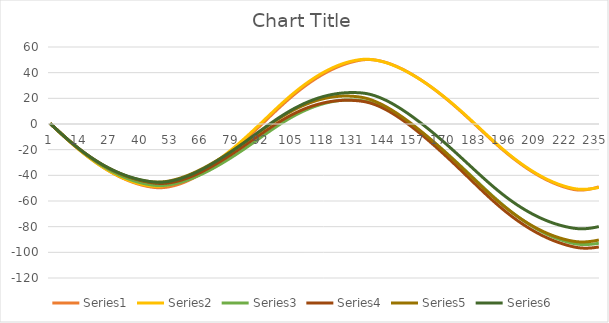
| Category | Series 0 | Series 1 | Series 2 | Series 3 | Series 4 | Series 5 |
|---|---|---|---|---|---|---|
| 0 | 0.4 | 0.4 | 0.4 | 0.4 | 0.4 | 0.4 |
| 1 | -1.3 | -1.302 | -1.299 | -1.296 | -1.297 | -1.296 |
| 2 | -2.99 | -3.008 | -2.993 | -2.984 | -2.985 | -2.984 |
| 3 | -4.69 | -4.713 | -4.68 | -4.659 | -4.663 | -4.659 |
| 4 | -6.38 | -6.414 | -6.357 | -6.32 | -6.327 | -6.32 |
| 5 | -8.07 | -8.107 | -8.022 | -7.964 | -7.975 | -7.964 |
| 6 | -9.74 | -9.789 | -9.67 | -9.588 | -9.604 | -9.587 |
| 7 | -11.4 | -11.456 | -11.301 | -11.189 | -11.21 | -11.187 |
| 8 | -13.03 | -13.103 | -12.909 | -12.763 | -12.792 | -12.761 |
| 9 | -14.65 | -14.726 | -14.494 | -14.31 | -14.346 | -14.306 |
| 10 | -16.24 | -16.324 | -16.052 | -15.827 | -15.869 | -15.821 |
| 11 | -17.81 | -17.894 | -17.581 | -17.311 | -17.361 | -17.302 |
| 12 | -19.35 | -19.434 | -19.08 | -18.761 | -18.819 | -18.749 |
| 13 | -20.85 | -20.943 | -20.549 | -20.178 | -20.244 | -20.162 |
| 14 | -22.33 | -22.42 | -21.984 | -21.559 | -21.633 | -21.538 |
| 15 | -23.78 | -23.862 | -23.387 | -22.904 | -22.985 | -22.878 |
| 16 | -25.2 | -25.269 | -24.755 | -24.212 | -24.301 | -24.18 |
| 17 | -26.58 | -26.642 | -26.088 | -25.485 | -25.579 | -25.446 |
| 18 | -27.93 | -27.98 | -27.387 | -26.72 | -26.82 | -26.673 |
| 19 | -29.25 | -29.284 | -28.651 | -27.92 | -28.024 | -27.864 |
| 20 | -30.53 | -30.554 | -29.882 | -29.084 | -29.192 | -29.019 |
| 21 | -31.78 | -31.788 | -31.076 | -30.213 | -30.323 | -30.137 |
| 22 | -32.98 | -32.985 | -32.235 | -31.304 | -31.415 | -31.217 |
| 23 | -34.16 | -34.144 | -33.356 | -32.358 | -32.467 | -32.258 |
| 24 | -35.29 | -35.262 | -34.439 | -33.375 | -33.48 | -33.26 |
| 25 | -36.39 | -36.34 | -35.484 | -34.354 | -34.453 | -34.224 |
| 26 | -37.45 | -37.379 | -36.491 | -35.296 | -35.387 | -35.15 |
| 27 | -38.48 | -38.377 | -37.461 | -36.201 | -36.282 | -36.037 |
| 28 | -39.46 | -39.333 | -38.39 | -37.068 | -37.135 | -36.884 |
| 29 | -40.4 | -40.245 | -39.278 | -37.896 | -37.946 | -37.691 |
| 30 | -41.3 | -41.114 | -40.126 | -38.687 | -38.717 | -38.459 |
| 31 | -42.16 | -41.939 | -40.934 | -39.439 | -39.446 | -39.188 |
| 32 | -42.98 | -42.718 | -41.701 | -40.154 | -40.134 | -39.877 |
| 33 | -43.75 | -43.451 | -42.426 | -40.832 | -40.78 | -40.526 |
| 34 | -44.48 | -44.139 | -43.109 | -41.47 | -41.383 | -41.136 |
| 35 | -45.17 | -44.782 | -43.751 | -42.071 | -41.945 | -41.706 |
| 36 | -45.81 | -45.38 | -44.351 | -42.637 | -42.465 | -42.238 |
| 37 | -46.41 | -45.933 | -44.91 | -43.166 | -42.945 | -42.732 |
| 38 | -46.97 | -46.437 | -45.427 | -43.658 | -43.382 | -43.187 |
| 39 | -47.47 | -46.892 | -45.902 | -44.114 | -43.778 | -43.604 |
| 40 | -47.94 | -47.294 | -46.333 | -44.533 | -44.132 | -43.982 |
| 41 | -48.35 | -47.646 | -46.723 | -44.917 | -44.444 | -44.322 |
| 42 | -48.72 | -47.945 | -47.069 | -45.266 | -44.715 | -44.624 |
| 43 | -49.04 | -48.188 | -47.373 | -45.579 | -44.943 | -44.889 |
| 44 | -49.32 | -48.373 | -47.63 | -45.854 | -45.127 | -45.113 |
| 45 | -49.53 | -48.488 | -47.828 | -46.078 | -45.253 | -45.283 |
| 46 | -49.65 | -48.514 | -47.948 | -46.234 | -45.303 | -45.383 |
| 47 | -49.67 | -48.442 | -47.983 | -46.315 | -45.27 | -45.405 |
| 48 | -49.6 | -48.28 | -47.936 | -46.316 | -45.156 | -45.346 |
| 49 | -49.44 | -48.044 | -47.816 | -46.237 | -44.967 | -45.209 |
| 50 | -49.21 | -47.737 | -47.629 | -46.079 | -44.708 | -44.996 |
| 51 | -48.9 | -47.36 | -47.376 | -45.848 | -44.383 | -44.712 |
| 52 | -48.52 | -46.924 | -47.069 | -45.553 | -44.001 | -44.367 |
| 53 | -48.08 | -46.433 | -46.712 | -45.202 | -43.569 | -43.968 |
| 54 | -47.59 | -45.885 | -46.307 | -44.795 | -43.088 | -43.513 |
| 55 | -47.03 | -45.284 | -45.854 | -44.334 | -42.557 | -43.006 |
| 56 | -46.41 | -44.627 | -45.353 | -43.819 | -41.978 | -42.447 |
| 57 | -45.73 | -43.916 | -44.805 | -43.251 | -41.352 | -41.836 |
| 58 | -44.99 | -43.153 | -44.213 | -42.635 | -40.682 | -41.178 |
| 59 | -44.19 | -42.341 | -43.58 | -41.973 | -39.971 | -40.474 |
| 60 | -43.34 | -41.482 | -42.907 | -41.267 | -39.22 | -39.728 |
| 61 | -42.45 | -40.578 | -42.197 | -40.522 | -38.434 | -38.943 |
| 62 | -41.51 | -39.632 | -41.454 | -39.74 | -37.613 | -38.12 |
| 63 | -40.52 | -38.645 | -40.677 | -38.922 | -36.761 | -37.263 |
| 64 | -39.49 | -37.616 | -39.866 | -38.068 | -35.875 | -36.37 |
| 65 | -38.42 | -36.544 | -39.021 | -37.179 | -34.957 | -35.441 |
| 66 | -37.3 | -35.432 | -38.143 | -36.255 | -34.008 | -34.478 |
| 67 | -36.14 | -34.281 | -37.235 | -35.301 | -33.029 | -33.483 |
| 68 | -34.94 | -33.094 | -36.299 | -34.319 | -32.025 | -32.461 |
| 69 | -33.7 | -31.874 | -35.338 | -33.311 | -30.997 | -31.412 |
| 70 | -32.42 | -30.619 | -34.351 | -32.277 | -29.946 | -30.338 |
| 71 | -31.12 | -29.331 | -33.34 | -31.22 | -28.871 | -29.239 |
| 72 | -29.78 | -28.011 | -32.305 | -30.141 | -27.776 | -28.117 |
| 73 | -28.41 | -26.661 | -31.248 | -29.041 | -26.662 | -26.974 |
| 74 | -27.01 | -25.281 | -30.171 | -27.921 | -25.528 | -25.81 |
| 75 | -25.58 | -23.873 | -29.073 | -26.783 | -24.378 | -24.628 |
| 76 | -24.12 | -22.437 | -27.957 | -25.629 | -23.211 | -23.428 |
| 77 | -22.64 | -20.975 | -26.822 | -24.459 | -22.03 | -22.212 |
| 78 | -21.13 | -19.486 | -25.67 | -23.274 | -20.832 | -20.98 |
| 79 | -19.59 | -17.97 | -24.499 | -22.073 | -19.62 | -19.731 |
| 80 | -18.03 | -16.428 | -23.312 | -20.859 | -18.395 | -18.468 |
| 81 | -16.44 | -14.861 | -22.108 | -19.631 | -17.155 | -17.19 |
| 82 | -14.83 | -13.268 | -20.886 | -18.39 | -15.902 | -15.897 |
| 83 | -13.19 | -11.651 | -19.649 | -17.137 | -14.636 | -14.591 |
| 84 | -11.54 | -10.012 | -18.399 | -15.874 | -13.36 | -13.276 |
| 85 | -9.86 | -8.352 | -17.137 | -14.605 | -12.077 | -11.951 |
| 86 | -8.17 | -6.675 | -15.866 | -13.33 | -10.788 | -10.621 |
| 87 | -6.46 | -4.982 | -14.588 | -12.054 | -9.496 | -9.288 |
| 88 | -4.75 | -3.276 | -13.306 | -10.777 | -8.204 | -7.953 |
| 89 | -3.02 | -1.559 | -12.022 | -9.504 | -6.913 | -6.62 |
| 90 | -1.29 | 0.165 | -10.739 | -8.236 | -5.627 | -5.291 |
| 91 | 0.45 | 1.896 | -9.458 | -6.975 | -4.346 | -3.969 |
| 92 | 2.19 | 3.631 | -8.181 | -5.723 | -3.074 | -2.653 |
| 93 | 3.93 | 5.366 | -6.911 | -4.484 | -1.813 | -1.349 |
| 94 | 5.67 | 7.1 | -5.651 | -3.259 | -0.565 | -0.058 |
| 95 | 7.4 | 8.83 | -4.402 | -2.05 | 0.668 | 1.218 |
| 96 | 9.12 | 10.552 | -3.168 | -0.861 | 1.882 | 2.475 |
| 97 | 10.83 | 12.262 | -1.951 | 0.305 | 3.075 | 3.712 |
| 98 | 12.52 | 13.955 | -0.755 | 1.447 | 4.244 | 4.924 |
| 99 | 14.2 | 15.628 | 0.418 | 2.561 | 5.385 | 6.11 |
| 100 | 15.85 | 17.279 | 1.567 | 3.645 | 6.499 | 7.269 |
| 101 | 17.48 | 18.903 | 2.687 | 4.698 | 7.581 | 8.396 |
| 102 | 19.08 | 20.497 | 3.777 | 5.716 | 8.629 | 9.49 |
| 103 | 20.65 | 22.059 | 4.834 | 6.697 | 9.641 | 10.548 |
| 104 | 22.19 | 23.589 | 5.858 | 7.642 | 10.617 | 11.571 |
| 105 | 23.69 | 25.085 | 6.847 | 8.55 | 11.554 | 12.557 |
| 106 | 25.17 | 26.546 | 7.801 | 9.419 | 12.454 | 13.506 |
| 107 | 26.61 | 27.971 | 8.72 | 10.25 | 13.315 | 14.418 |
| 108 | 28.01 | 29.361 | 9.602 | 11.042 | 14.137 | 15.292 |
| 109 | 29.37 | 30.714 | 10.447 | 11.796 | 14.92 | 16.128 |
| 110 | 30.7 | 32.03 | 11.254 | 12.51 | 15.661 | 16.924 |
| 111 | 31.99 | 33.307 | 12.021 | 13.182 | 16.361 | 17.681 |
| 112 | 33.25 | 34.546 | 12.75 | 13.817 | 17.021 | 18.399 |
| 113 | 34.46 | 35.747 | 13.441 | 14.411 | 17.639 | 19.079 |
| 114 | 35.64 | 36.908 | 14.091 | 14.966 | 18.217 | 19.72 |
| 115 | 36.77 | 38.029 | 14.703 | 15.482 | 18.753 | 20.321 |
| 116 | 37.87 | 39.109 | 15.272 | 15.957 | 19.245 | 20.882 |
| 117 | 38.92 | 40.146 | 15.8 | 16.391 | 19.695 | 21.403 |
| 118 | 39.94 | 41.139 | 16.287 | 16.785 | 20.102 | 21.884 |
| 119 | 40.91 | 42.086 | 16.731 | 17.138 | 20.465 | 22.324 |
| 120 | 41.84 | 42.988 | 17.132 | 17.451 | 20.784 | 22.724 |
| 121 | 42.72 | 43.843 | 17.491 | 17.723 | 21.06 | 23.083 |
| 122 | 43.57 | 44.65 | 17.806 | 17.955 | 21.292 | 23.402 |
| 123 | 44.36 | 45.409 | 18.077 | 18.146 | 21.479 | 23.68 |
| 124 | 45.12 | 46.118 | 18.303 | 18.296 | 21.621 | 23.918 |
| 125 | 45.82 | 46.778 | 18.485 | 18.405 | 21.718 | 24.114 |
| 126 | 46.48 | 47.387 | 18.622 | 18.475 | 21.77 | 24.27 |
| 127 | 47.09 | 47.946 | 18.714 | 18.505 | 21.779 | 24.387 |
| 128 | 47.66 | 48.455 | 18.763 | 18.496 | 21.743 | 24.464 |
| 129 | 48.18 | 48.913 | 18.767 | 18.449 | 21.664 | 24.503 |
| 130 | 48.65 | 49.319 | 18.727 | 18.364 | 21.541 | 24.503 |
| 131 | 49.08 | 49.673 | 18.642 | 18.241 | 21.373 | 24.463 |
| 132 | 49.46 | 49.973 | 18.51 | 18.077 | 21.16 | 24.384 |
| 133 | 49.78 | 50.214 | 18.326 | 17.871 | 20.897 | 24.26 |
| 134 | 50.03 | 50.384 | 18.08 | 17.609 | 20.573 | 24.081 |
| 135 | 50.19 | 50.468 | 17.757 | 17.28 | 20.173 | 23.832 |
| 136 | 50.25 | 50.456 | 17.348 | 16.873 | 19.689 | 23.506 |
| 137 | 50.21 | 50.344 | 16.848 | 16.387 | 19.116 | 23.098 |
| 138 | 50.08 | 50.158 | 16.275 | 15.819 | 18.469 | 22.61 |
| 139 | 49.87 | 49.9 | 15.635 | 15.173 | 17.752 | 22.045 |
| 140 | 49.59 | 49.577 | 14.933 | 14.456 | 16.971 | 21.41 |
| 141 | 49.24 | 49.194 | 14.177 | 13.676 | 16.135 | 20.713 |
| 142 | 48.84 | 48.754 | 13.37 | 12.839 | 15.247 | 19.96 |
| 143 | 48.37 | 48.259 | 12.515 | 11.945 | 14.31 | 19.151 |
| 144 | 47.85 | 47.71 | 11.613 | 10.997 | 13.324 | 18.288 |
| 145 | 47.26 | 47.105 | 10.662 | 9.995 | 12.29 | 17.372 |
| 146 | 46.61 | 46.445 | 9.664 | 8.939 | 11.207 | 16.402 |
| 147 | 45.9 | 45.732 | 8.62 | 7.833 | 10.079 | 15.383 |
| 148 | 45.14 | 44.97 | 7.535 | 6.681 | 8.909 | 14.318 |
| 149 | 44.34 | 44.165 | 6.415 | 5.489 | 7.705 | 13.215 |
| 150 | 43.49 | 43.322 | 5.265 | 4.264 | 6.471 | 12.077 |
| 151 | 42.6 | 42.438 | 4.083 | 3.004 | 5.205 | 10.905 |
| 152 | 41.68 | 41.515 | 2.869 | 1.709 | 3.909 | 9.699 |
| 153 | 40.71 | 40.553 | 1.624 | 0.381 | 2.582 | 8.458 |
| 154 | 39.7 | 39.552 | 0.349 | -0.98 | 1.226 | 7.186 |
| 155 | 38.65 | 38.514 | -0.954 | -2.371 | -0.157 | 5.884 |
| 156 | 37.56 | 37.443 | -2.283 | -3.788 | -1.564 | 4.555 |
| 157 | 36.44 | 36.342 | -3.634 | -5.228 | -2.992 | 3.203 |
| 158 | 35.29 | 35.211 | -5.005 | -6.69 | -4.438 | 1.829 |
| 159 | 34.11 | 34.051 | -6.397 | -8.174 | -5.904 | 0.434 |
| 160 | 32.89 | 32.86 | -7.81 | -9.678 | -7.39 | -0.983 |
| 161 | 31.65 | 31.639 | -9.246 | -11.205 | -8.896 | -2.422 |
| 162 | 30.37 | 30.387 | -10.705 | -12.754 | -10.422 | -3.883 |
| 163 | 29.06 | 29.104 | -12.186 | -14.325 | -11.969 | -5.367 |
| 164 | 27.72 | 27.791 | -13.688 | -15.916 | -13.535 | -6.871 |
| 165 | 26.35 | 26.45 | -15.209 | -17.525 | -15.118 | -8.393 |
| 166 | 24.95 | 25.081 | -16.75 | -19.152 | -16.717 | -9.934 |
| 167 | 23.53 | 23.685 | -18.31 | -20.796 | -18.333 | -11.492 |
| 168 | 22.09 | 22.264 | -19.885 | -22.454 | -19.962 | -13.064 |
| 169 | 20.61 | 20.819 | -21.476 | -24.125 | -21.604 | -14.649 |
| 170 | 19.12 | 19.347 | -23.084 | -25.81 | -23.26 | -16.25 |
| 171 | 17.59 | 17.851 | -24.709 | -27.51 | -24.93 | -17.865 |
| 172 | 16.05 | 16.33 | -26.35 | -29.222 | -26.612 | -19.493 |
| 173 | 14.48 | 14.786 | -28.004 | -30.945 | -28.306 | -21.132 |
| 174 | 12.89 | 13.221 | -29.672 | -32.678 | -30.009 | -22.781 |
| 175 | 11.28 | 11.635 | -31.351 | -34.418 | -31.72 | -24.439 |
| 176 | 9.66 | 10.03 | -33.041 | -36.166 | -33.44 | -26.104 |
| 177 | 8.01 | 8.406 | -34.741 | -37.92 | -35.165 | -27.776 |
| 178 | 6.35 | 6.767 | -36.448 | -39.677 | -36.894 | -29.451 |
| 179 | 4.68 | 5.111 | -38.163 | -41.437 | -38.627 | -31.129 |
| 180 | 2.99 | 3.441 | -39.884 | -43.199 | -40.363 | -32.81 |
| 181 | 1.3 | 1.758 | -41.61 | -44.961 | -42.1 | -34.491 |
| 182 | -0.4 | 0.066 | -43.337 | -46.72 | -43.835 | -36.169 |
| 183 | -2.11 | -1.633 | -45.062 | -48.472 | -45.564 | -37.841 |
| 184 | -3.82 | -3.336 | -46.784 | -50.217 | -47.286 | -39.505 |
| 185 | -5.53 | -5.039 | -48.499 | -51.95 | -48.997 | -41.158 |
| 186 | -7.23 | -6.74 | -50.205 | -53.669 | -50.696 | -42.796 |
| 187 | -8.93 | -8.435 | -51.9 | -55.372 | -52.38 | -44.419 |
| 188 | -10.62 | -10.119 | -53.58 | -57.056 | -54.045 | -46.022 |
| 189 | -12.29 | -11.79 | -55.242 | -58.718 | -55.689 | -47.603 |
| 190 | -13.94 | -13.445 | -56.885 | -60.356 | -57.31 | -49.159 |
| 191 | -15.57 | -15.08 | -58.506 | -61.968 | -58.905 | -50.689 |
| 192 | -17.18 | -16.691 | -60.102 | -63.551 | -60.472 | -52.19 |
| 193 | -18.77 | -18.276 | -61.671 | -65.103 | -62.009 | -53.659 |
| 194 | -20.32 | -19.834 | -63.211 | -66.622 | -63.513 | -55.095 |
| 195 | -21.86 | -21.364 | -64.722 | -68.109 | -64.985 | -56.498 |
| 196 | -23.36 | -22.866 | -66.204 | -69.564 | -66.425 | -57.868 |
| 197 | -24.83 | -24.337 | -67.654 | -70.985 | -67.83 | -59.204 |
| 198 | -26.28 | -25.776 | -69.072 | -72.371 | -69.2 | -60.504 |
| 199 | -27.69 | -27.184 | -70.457 | -73.721 | -70.535 | -61.768 |
| 200 | -29.07 | -28.559 | -71.808 | -75.036 | -71.833 | -62.995 |
| 201 | -30.42 | -29.901 | -73.125 | -76.314 | -73.094 | -64.185 |
| 202 | -31.73 | -31.209 | -74.406 | -77.556 | -74.316 | -65.337 |
| 203 | -33.02 | -32.484 | -75.652 | -78.761 | -75.502 | -66.453 |
| 204 | -34.26 | -33.726 | -76.864 | -79.932 | -76.652 | -67.533 |
| 205 | -35.48 | -34.934 | -78.041 | -81.067 | -77.764 | -68.576 |
| 206 | -36.65 | -36.108 | -79.183 | -82.167 | -78.84 | -69.583 |
| 207 | -37.8 | -37.245 | -80.288 | -83.231 | -79.876 | -70.552 |
| 208 | -38.9 | -38.343 | -81.355 | -84.257 | -80.874 | -71.483 |
| 209 | -39.97 | -39.404 | -82.386 | -85.247 | -81.833 | -72.377 |
| 210 | -40.99 | -40.425 | -83.378 | -86.2 | -82.753 | -73.232 |
| 211 | -41.98 | -41.405 | -84.331 | -87.116 | -83.632 | -74.048 |
| 212 | -42.93 | -42.345 | -85.246 | -87.996 | -84.472 | -74.827 |
| 213 | -43.84 | -43.242 | -86.12 | -88.837 | -85.27 | -75.566 |
| 214 | -44.7 | -44.097 | -86.954 | -89.64 | -86.028 | -76.265 |
| 215 | -45.53 | -44.908 | -87.747 | -90.406 | -86.743 | -76.925 |
| 216 | -46.31 | -45.678 | -88.5 | -91.136 | -87.419 | -77.547 |
| 217 | -47.05 | -46.403 | -89.213 | -91.829 | -88.054 | -78.131 |
| 218 | -47.74 | -47.083 | -89.885 | -92.485 | -88.647 | -78.676 |
| 219 | -48.39 | -47.718 | -90.516 | -93.105 | -89.2 | -79.183 |
| 220 | -49 | -48.308 | -91.105 | -93.688 | -89.711 | -79.652 |
| 221 | -49.56 | -48.852 | -91.652 | -94.235 | -90.181 | -80.082 |
| 222 | -50.07 | -49.348 | -92.157 | -94.745 | -90.609 | -80.474 |
| 223 | -50.54 | -49.793 | -92.618 | -95.218 | -90.993 | -80.825 |
| 224 | -50.93 | -50.183 | -93.028 | -95.646 | -91.327 | -81.13 |
| 225 | -51.24 | -50.502 | -93.375 | -96.02 | -91.6 | -81.378 |
| 226 | -51.44 | -50.737 | -93.644 | -96.324 | -91.796 | -81.554 |
| 227 | -51.51 | -50.879 | -93.828 | -96.551 | -91.909 | -81.651 |
| 228 | -51.46 | -50.922 | -93.922 | -96.7 | -91.935 | -81.666 |
| 229 | -51.31 | -50.891 | -93.944 | -96.767 | -91.886 | -81.602 |
| 230 | -51.07 | -50.79 | -93.9 | -96.757 | -91.769 | -81.464 |
| 231 | -50.77 | -50.626 | -93.797 | -96.68 | -91.591 | -81.26 |
| 232 | -50.4 | -50.406 | -93.644 | -96.545 | -91.362 | -81.001 |
| 233 | -49.98 | -50.135 | -93.446 | -96.358 | -91.087 | -80.691 |
| 234 | -49.5 | -49.808 | -93.2 | -96.114 | -90.762 | -80.326 |
| 235 | -48.96 | -49.426 | -92.905 | -95.816 | -90.388 | -79.909 |